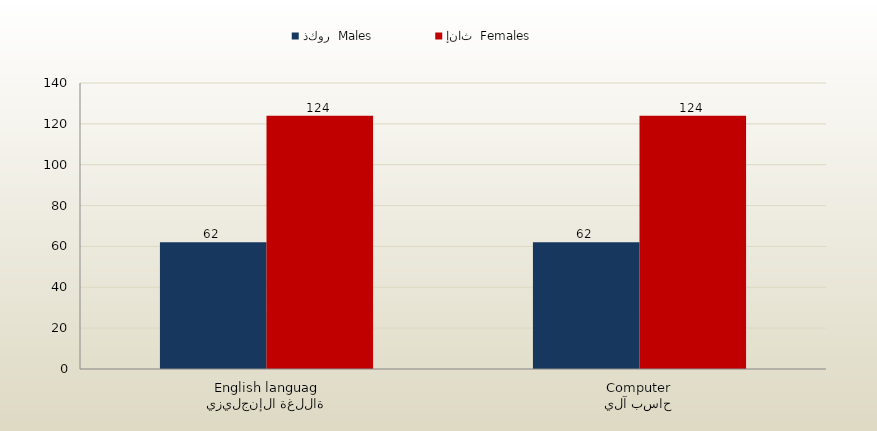
| Category | ذكور  Males | إناث  Females |
|---|---|---|
| اللغة الإنجليزية
English language | 62 | 124 |
| حاسب آلي
Computer | 62 | 124 |